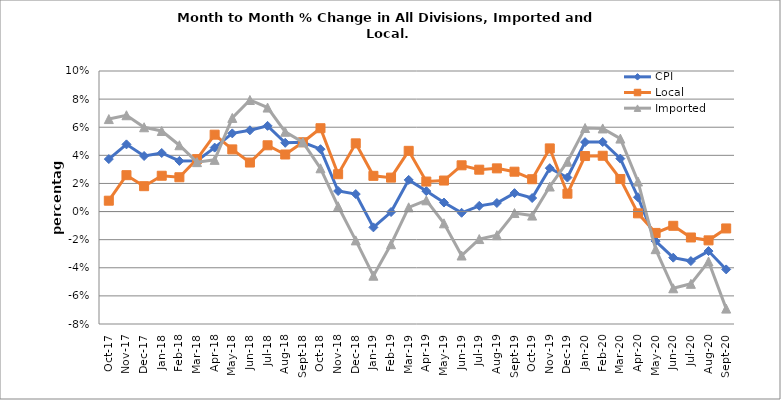
| Category | CPI | Local | Imported |
|---|---|---|---|
| 2017-10-01 | 0.037 | 0.008 | 0.066 |
| 2017-11-01 | 0.048 | 0.026 | 0.069 |
| 2017-12-01 | 0.04 | 0.018 | 0.06 |
| 2018-01-01 | 0.042 | 0.025 | 0.057 |
| 2018-02-01 | 0.036 | 0.024 | 0.047 |
| 2018-03-01 | 0.036 | 0.037 | 0.035 |
| 2018-04-01 | 0.045 | 0.055 | 0.037 |
| 2018-05-01 | 0.056 | 0.044 | 0.067 |
| 2018-06-01 | 0.058 | 0.035 | 0.079 |
| 2018-07-01 | 0.061 | 0.047 | 0.074 |
| 2018-08-01 | 0.049 | 0.041 | 0.057 |
| 2018-09-01 | 0.049 | 0.049 | 0.049 |
| 2018-10-01 | 0.044 | 0.059 | 0.031 |
| 2018-11-01 | 0.015 | 0.027 | 0.004 |
| 2018-12-01 | 0.012 | 0.049 | -0.021 |
| 2019-01-01 | -0.011 | 0.025 | -0.046 |
| 2019-02-01 | 0 | 0.024 | -0.023 |
| 2019-03-01 | 0.023 | 0.043 | 0.003 |
| 2019-04-01 | 0.015 | 0.021 | 0.008 |
| 2019-05-01 | 0.006 | 0.022 | -0.008 |
| 2019-06-01 | -0.001 | 0.033 | -0.031 |
| 2019-07-01 | 0.004 | 0.03 | -0.02 |
| 2019-08-01 | 0.006 | 0.031 | -0.017 |
| 2019-09-01 | 0.013 | 0.028 | -0.001 |
| 2019-10-01 | 0.01 | 0.023 | -0.003 |
| 2019-11-01 | 0.031 | 0.045 | 0.018 |
| 2019-12-01 | 0.024 | 0.013 | 0.035 |
| 2020-01-01 | 0.049 | 0.039 | 0.059 |
| 2020-02-01 | 0.05 | 0.04 | 0.059 |
| 2020-03-01 | 0.038 | 0.023 | 0.052 |
| 2020-04-01 | 0.01 | -0.001 | 0.021 |
| 2020-05-01 | -0.021 | -0.015 | -0.027 |
| 2020-06-01 | -0.033 | -0.01 | -0.055 |
| 2020-07-01 | -0.035 | -0.018 | -0.051 |
| 2020-08-01 | -0.028 | -0.02 | -0.036 |
| 2020-09-01 | -0.041 | -0.012 | -0.069 |